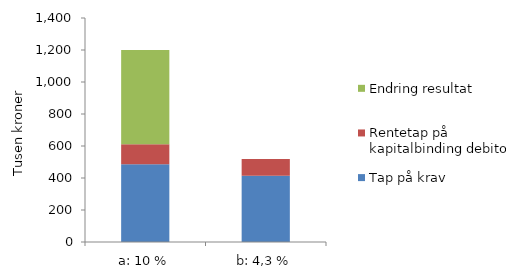
| Category | Tap på krav | Rentetap på kapitalbinding debitorer | Endring resultat |
|---|---|---|---|
| a: 10 % | 486 | 124.274 | 589.726 |
| b: 4,3 % | 414 | 104 | 0 |